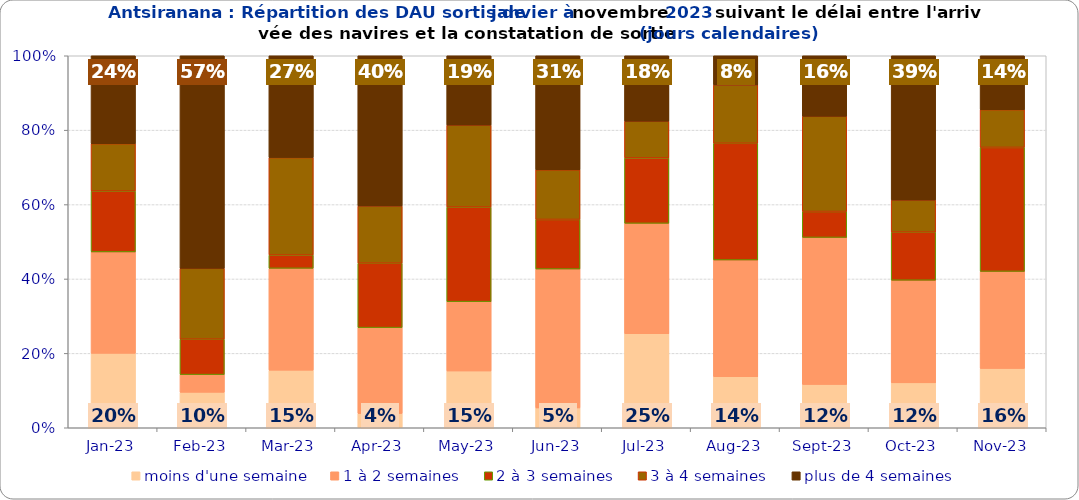
| Category | moins d'une semaine | 1 à 2 semaines | 2 à 3 semaines | 3 à 4 semaines | plus de 4 semaines |
|---|---|---|---|---|---|
| 2023-01-01 | 0.2 | 0.273 | 0.164 | 0.127 | 0.236 |
| 2023-02-01 | 0.095 | 0.048 | 0.095 | 0.19 | 0.571 |
| 2023-03-01 | 0.155 | 0.274 | 0.036 | 0.262 | 0.274 |
| 2023-04-01 | 0.038 | 0.231 | 0.173 | 0.154 | 0.404 |
| 2023-05-01 | 0.153 | 0.186 | 0.254 | 0.22 | 0.186 |
| 2023-06-01 | 0.053 | 0.373 | 0.133 | 0.133 | 0.307 |
| 2023-07-01 | 0.253 | 0.297 | 0.176 | 0.099 | 0.176 |
| 2023-08-01 | 0.137 | 0.314 | 0.314 | 0.157 | 0.078 |
| 2023-09-01 | 0.116 | 0.395 | 0.07 | 0.256 | 0.163 |
| 2023-10-01 | 0.121 | 0.276 | 0.129 | 0.086 | 0.388 |
| 2023-11-01 | 0.159 | 0.261 | 0.333 | 0.101 | 0.145 |